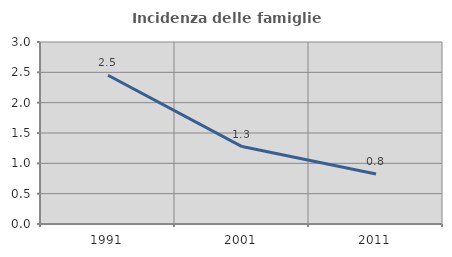
| Category | Incidenza delle famiglie numerose |
|---|---|
| 1991.0 | 2.452 |
| 2001.0 | 1.276 |
| 2011.0 | 0.824 |